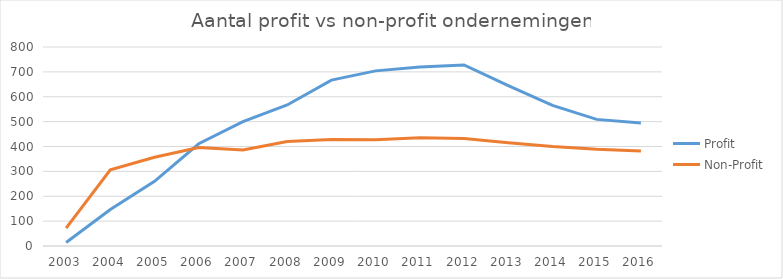
| Category | Profit | Non-Profit |
|---|---|---|
| 2003.0 | 14 | 72 |
| 2004.0 | 147 | 306 |
| 2005.0 | 260 | 357 |
| 2006.0 | 411 | 396 |
| 2007.0 | 500 | 386 |
| 2008.0 | 567 | 420 |
| 2009.0 | 667 | 428 |
| 2010.0 | 704 | 427 |
| 2011.0 | 720 | 435 |
| 2012.0 | 728 | 432 |
| 2013.0 | 645 | 415 |
| 2014.0 | 565 | 400 |
| 2015.0 | 509 | 389 |
| 2016.0 | 494 | 382 |